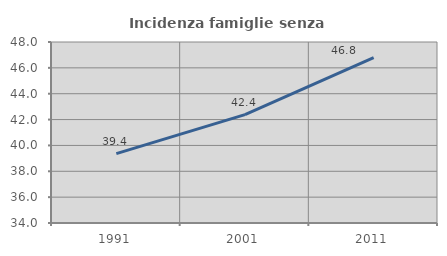
| Category | Incidenza famiglie senza nuclei |
|---|---|
| 1991.0 | 39.37 |
| 2001.0 | 42.382 |
| 2011.0 | 46.797 |